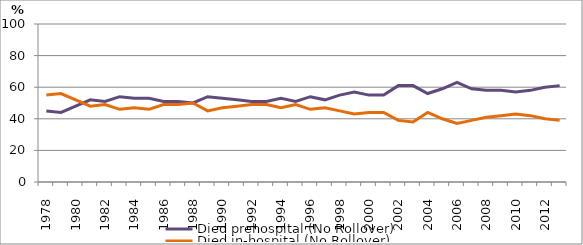
| Category | Died prehospital (No Rollover) | Died in-hospital (No Rollover) |
|---|---|---|
| 1978.0 | 45 | 55 |
| 1979.0 | 44 | 56 |
| 1980.0 | 48 | 52 |
| 1981.0 | 52 | 48 |
| 1982.0 | 51 | 49 |
| 1983.0 | 54 | 46 |
| 1984.0 | 53 | 47 |
| 1985.0 | 53 | 46 |
| 1986.0 | 51 | 49 |
| 1987.0 | 51 | 49 |
| 1988.0 | 50 | 50 |
| 1989.0 | 54 | 45 |
| 1990.0 | 53 | 47 |
| 1991.0 | 52 | 48 |
| 1992.0 | 51 | 49 |
| 1993.0 | 51 | 49 |
| 1994.0 | 53 | 47 |
| 1995.0 | 51 | 49 |
| 1996.0 | 54 | 46 |
| 1997.0 | 52 | 47 |
| 1998.0 | 55 | 45 |
| 1999.0 | 57 | 43 |
| 2000.0 | 55 | 44 |
| 2001.0 | 55 | 44 |
| 2002.0 | 61 | 39 |
| 2003.0 | 61 | 38 |
| 2004.0 | 56 | 44 |
| 2005.0 | 59 | 40 |
| 2006.0 | 63 | 37 |
| 2007.0 | 59 | 39 |
| 2008.0 | 58 | 41 |
| 2009.0 | 58 | 42 |
| 2010.0 | 57 | 43 |
| 2011.0 | 58 | 42 |
| 2012.0 | 60 | 40 |
| 2013.0 | 61 | 39 |